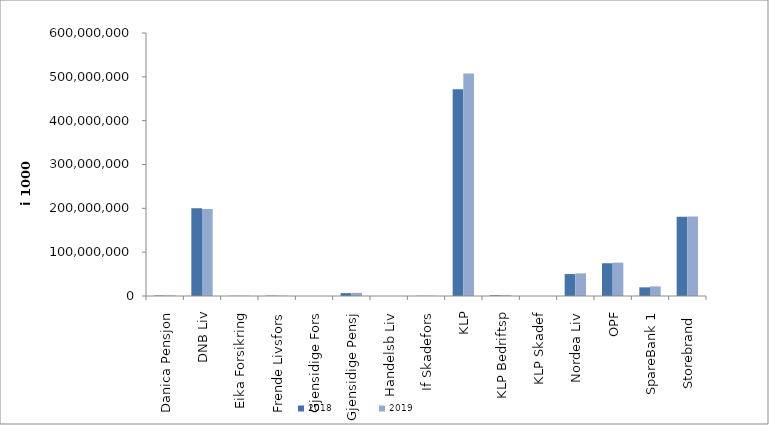
| Category | 2018 | 2019 |
|---|---|---|
| Danica Pensjon | 1144794.729 | 1179127.288 |
| DNB Liv | 200300987.28 | 198525277 |
| Eika Forsikring | 459894 | 503320 |
| Frende Livsfors | 771394 | 848727 |
| Gjensidige Fors | 0 | 0 |
| Gjensidige Pensj | 6586379 | 7183029 |
| Handelsb Liv | 23055 | 27038.082 |
| If Skadefors | 453992 | 512717.341 |
| KLP | 471726467.249 | 507748922.502 |
| KLP Bedriftsp | 1675894 | 1723587 |
| KLP Skadef | 22247 | 40612 |
| Nordea Liv | 50050246.092 | 51672210.116 |
| OPF | 74694000 | 76067254.041 |
| SpareBank 1 | 19767915.111 | 21982930.468 |
| Storebrand  | 180788161.222 | 181279490.908 |